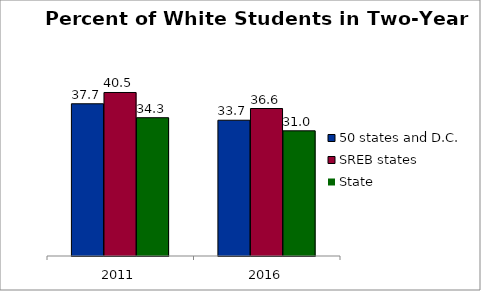
| Category | 50 states and D.C. | SREB states | State |
|---|---|---|---|
| 2011.0 | 37.743 | 40.54 | 34.287 |
| 2016.0 | 33.662 | 36.566 | 31.035 |